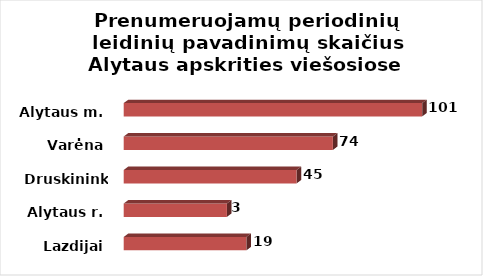
| Category | Series 0 |
|---|---|
| Lazdijai | 44 |
| Alytaus r. | 37 |
| Druskininkai | 62 |
| Varėna | 75 |
| Alytaus m. | 107 |